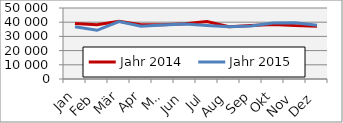
| Category | Jahr 2014 | Jahr 2015 |
|---|---|---|
| 0 | 39169.667 | 36759.858 |
| 1 | 38189.374 | 34300.69 |
| 2 | 40716.756 | 40449.646 |
| 3 | 38161.636 | 37133.304 |
| 4 | 38167.541 | 38006.709 |
| 5 | 38922.984 | 38704.521 |
| 6 | 40490.869 | 37705.623 |
| 7 | 36760.658 | 36760.943 |
| 8 | 37761.474 | 37312.348 |
| 9 | 38417.383 | 39457.092 |
| 10 | 37614.613 | 39584.752 |
| 11 | 37212.765 | 37864.414 |